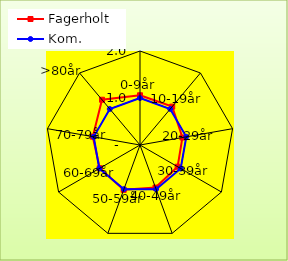
| Category | Fagerholt | Kom. |
|---|---|---|
| 0-9år | 1.058 | 1 |
| 10-19år | 1.066 | 1 |
| 20-29år | 0.916 | 1 |
| 30-39år | 0.924 | 1 |
| 40-49år | 0.964 | 1 |
| 50-59år | 1.015 | 1 |
| 60-69år | 0.989 | 1 |
| 70-79år | 1.02 | 1 |
| >80år | 1.257 | 1 |